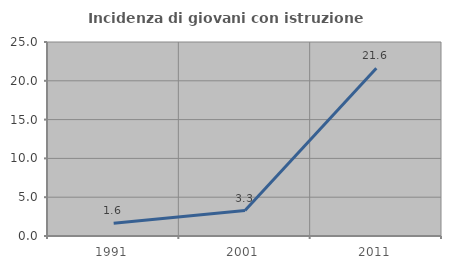
| Category | Incidenza di giovani con istruzione universitaria |
|---|---|
| 1991.0 | 1.639 |
| 2001.0 | 3.279 |
| 2011.0 | 21.622 |